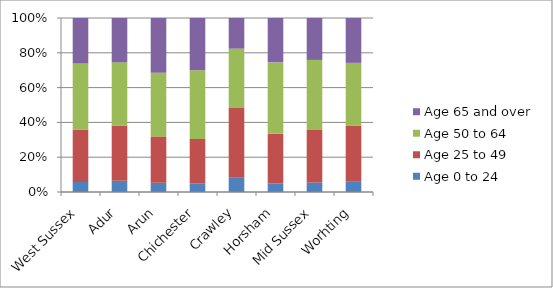
| Category | Age 0 to 24 | Age 25 to 49 | Age 50 to 64 | Age 65 and over |
|---|---|---|---|---|
| West Sussex | 4823 | 25330 | 31877 | 22048 |
| Adur | 448 | 2205 | 2515 | 1767 |
| Arun | 873 | 4390 | 6024 | 5190 |
| Chichester | 596 | 3196 | 4904 | 3735 |
| Crawley | 841 | 3930 | 3368 | 1738 |
| Horsham | 657 | 3901 | 5554 | 3462 |
| Mid Sussex | 766 | 4199 | 5605 | 3356 |
| Worhting | 642 | 3509 | 3907 | 2800 |